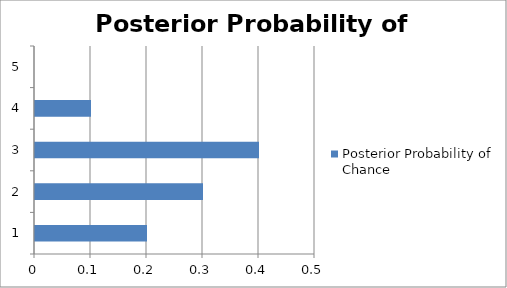
| Category | Posterior Probability of Chance |
|---|---|
| 0 | 0.2 |
| 1 | 0.3 |
| 2 | 0.4 |
| 3 | 0.1 |
| 4 | 0 |